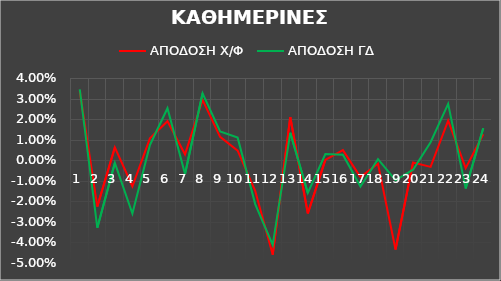
| Category | ΑΠΟΔΟΣΗ Χ/Φ | ΑΠΟΔΟΣΗ ΓΔ |
|---|---|---|
| 0 | 0.034 | 0.034 |
| 1 | -0.023 | -0.033 |
| 2 | 0.006 | -0.001 |
| 3 | -0.013 | -0.026 |
| 4 | 0.011 | 0.007 |
| 5 | 0.019 | 0.025 |
| 6 | 0.003 | -0.007 |
| 7 | 0.029 | 0.033 |
| 8 | 0.011 | 0.014 |
| 9 | 0.005 | 0.011 |
| 10 | -0.015 | -0.021 |
| 11 | -0.046 | -0.041 |
| 12 | 0.021 | 0.013 |
| 13 | -0.026 | -0.016 |
| 14 | 0 | 0.003 |
| 15 | 0.005 | 0.003 |
| 16 | -0.008 | -0.013 |
| 17 | -0.002 | 0.001 |
| 18 | -0.043 | -0.01 |
| 19 | -0.001 | -0.005 |
| 20 | -0.003 | 0.009 |
| 21 | 0.019 | 0.027 |
| 22 | -0.004 | -0.014 |
| 23 | 0.013 | 0.016 |